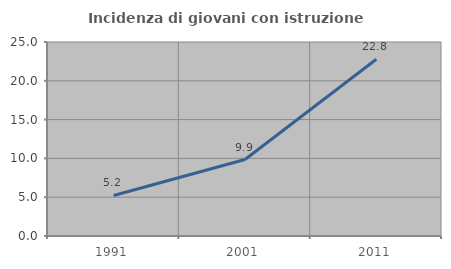
| Category | Incidenza di giovani con istruzione universitaria |
|---|---|
| 1991.0 | 5.228 |
| 2001.0 | 9.855 |
| 2011.0 | 22.77 |